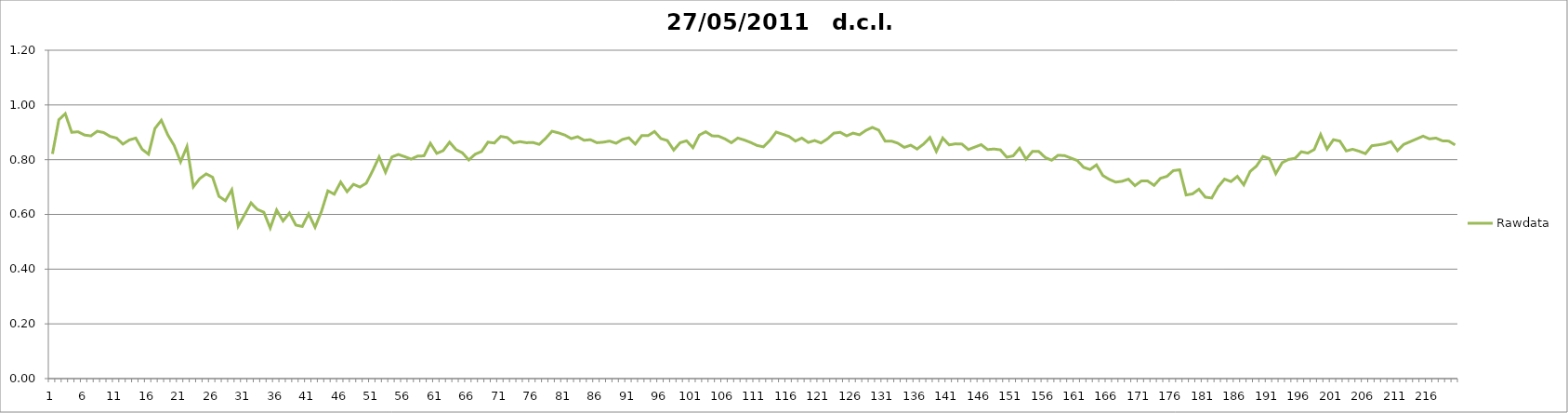
| Category | Rawdata |
|---|---|
| 0 | 0.821 |
| 1 | 0.946 |
| 2 | 0.968 |
| 3 | 0.9 |
| 4 | 0.902 |
| 5 | 0.89 |
| 6 | 0.887 |
| 7 | 0.904 |
| 8 | 0.899 |
| 9 | 0.885 |
| 10 | 0.879 |
| 11 | 0.857 |
| 12 | 0.872 |
| 13 | 0.879 |
| 14 | 0.838 |
| 15 | 0.82 |
| 16 | 0.914 |
| 17 | 0.944 |
| 18 | 0.891 |
| 19 | 0.852 |
| 20 | 0.792 |
| 21 | 0.848 |
| 22 | 0.701 |
| 23 | 0.731 |
| 24 | 0.748 |
| 25 | 0.736 |
| 26 | 0.666 |
| 27 | 0.65 |
| 28 | 0.69 |
| 29 | 0.557 |
| 30 | 0.599 |
| 31 | 0.642 |
| 32 | 0.618 |
| 33 | 0.608 |
| 34 | 0.55 |
| 35 | 0.616 |
| 36 | 0.576 |
| 37 | 0.605 |
| 38 | 0.561 |
| 39 | 0.556 |
| 40 | 0.602 |
| 41 | 0.553 |
| 42 | 0.611 |
| 43 | 0.686 |
| 44 | 0.674 |
| 45 | 0.718 |
| 46 | 0.683 |
| 47 | 0.71 |
| 48 | 0.7 |
| 49 | 0.714 |
| 50 | 0.76 |
| 51 | 0.81 |
| 52 | 0.754 |
| 53 | 0.81 |
| 54 | 0.819 |
| 55 | 0.811 |
| 56 | 0.802 |
| 57 | 0.813 |
| 58 | 0.814 |
| 59 | 0.86 |
| 60 | 0.823 |
| 61 | 0.833 |
| 62 | 0.864 |
| 63 | 0.837 |
| 64 | 0.825 |
| 65 | 0.799 |
| 66 | 0.82 |
| 67 | 0.83 |
| 68 | 0.864 |
| 69 | 0.861 |
| 70 | 0.885 |
| 71 | 0.881 |
| 72 | 0.861 |
| 73 | 0.866 |
| 74 | 0.862 |
| 75 | 0.863 |
| 76 | 0.856 |
| 77 | 0.878 |
| 78 | 0.904 |
| 79 | 0.898 |
| 80 | 0.89 |
| 81 | 0.877 |
| 82 | 0.884 |
| 83 | 0.871 |
| 84 | 0.873 |
| 85 | 0.862 |
| 86 | 0.864 |
| 87 | 0.868 |
| 88 | 0.86 |
| 89 | 0.874 |
| 90 | 0.88 |
| 91 | 0.857 |
| 92 | 0.888 |
| 93 | 0.888 |
| 94 | 0.903 |
| 95 | 0.877 |
| 96 | 0.87 |
| 97 | 0.835 |
| 98 | 0.862 |
| 99 | 0.869 |
| 100 | 0.844 |
| 101 | 0.89 |
| 102 | 0.902 |
| 103 | 0.887 |
| 104 | 0.886 |
| 105 | 0.876 |
| 106 | 0.862 |
| 107 | 0.879 |
| 108 | 0.872 |
| 109 | 0.863 |
| 110 | 0.852 |
| 111 | 0.847 |
| 112 | 0.87 |
| 113 | 0.901 |
| 114 | 0.893 |
| 115 | 0.885 |
| 116 | 0.868 |
| 117 | 0.879 |
| 118 | 0.863 |
| 119 | 0.87 |
| 120 | 0.861 |
| 121 | 0.876 |
| 122 | 0.897 |
| 123 | 0.9 |
| 124 | 0.887 |
| 125 | 0.897 |
| 126 | 0.891 |
| 127 | 0.907 |
| 128 | 0.918 |
| 129 | 0.908 |
| 130 | 0.868 |
| 131 | 0.868 |
| 132 | 0.86 |
| 133 | 0.845 |
| 134 | 0.853 |
| 135 | 0.839 |
| 136 | 0.857 |
| 137 | 0.881 |
| 138 | 0.83 |
| 139 | 0.879 |
| 140 | 0.854 |
| 141 | 0.858 |
| 142 | 0.857 |
| 143 | 0.837 |
| 144 | 0.846 |
| 145 | 0.855 |
| 146 | 0.837 |
| 147 | 0.839 |
| 148 | 0.836 |
| 149 | 0.809 |
| 150 | 0.814 |
| 151 | 0.842 |
| 152 | 0.802 |
| 153 | 0.83 |
| 154 | 0.83 |
| 155 | 0.808 |
| 156 | 0.798 |
| 157 | 0.816 |
| 158 | 0.815 |
| 159 | 0.806 |
| 160 | 0.797 |
| 161 | 0.772 |
| 162 | 0.764 |
| 163 | 0.781 |
| 164 | 0.742 |
| 165 | 0.728 |
| 166 | 0.718 |
| 167 | 0.721 |
| 168 | 0.729 |
| 169 | 0.705 |
| 170 | 0.722 |
| 171 | 0.722 |
| 172 | 0.706 |
| 173 | 0.732 |
| 174 | 0.739 |
| 175 | 0.76 |
| 176 | 0.763 |
| 177 | 0.671 |
| 178 | 0.675 |
| 179 | 0.692 |
| 180 | 0.663 |
| 181 | 0.66 |
| 182 | 0.701 |
| 183 | 0.729 |
| 184 | 0.72 |
| 185 | 0.739 |
| 186 | 0.708 |
| 187 | 0.757 |
| 188 | 0.777 |
| 189 | 0.812 |
| 190 | 0.804 |
| 191 | 0.749 |
| 192 | 0.789 |
| 193 | 0.801 |
| 194 | 0.805 |
| 195 | 0.829 |
| 196 | 0.824 |
| 197 | 0.837 |
| 198 | 0.892 |
| 199 | 0.839 |
| 200 | 0.873 |
| 201 | 0.868 |
| 202 | 0.832 |
| 203 | 0.838 |
| 204 | 0.831 |
| 205 | 0.822 |
| 206 | 0.851 |
| 207 | 0.854 |
| 208 | 0.858 |
| 209 | 0.866 |
| 210 | 0.833 |
| 211 | 0.856 |
| 212 | 0.866 |
| 213 | 0.876 |
| 214 | 0.886 |
| 215 | 0.876 |
| 216 | 0.879 |
| 217 | 0.869 |
| 218 | 0.868 |
| 219 | 0.854 |